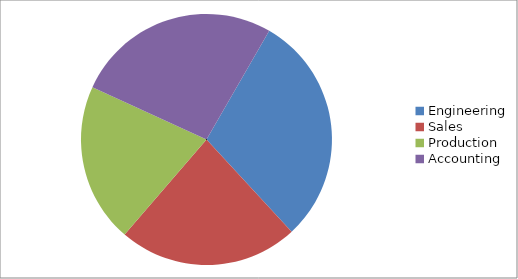
| Category | Sales1 |
|---|---|
| Engineering | 900 |
| Sales | 700 |
| Production | 620 |
| Accounting | 800 |